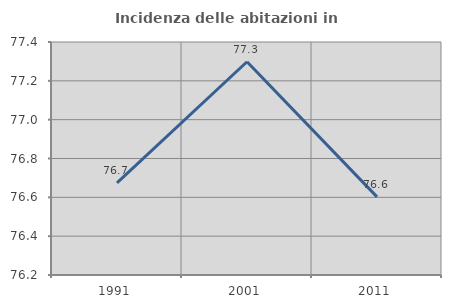
| Category | Incidenza delle abitazioni in proprietà  |
|---|---|
| 1991.0 | 76.675 |
| 2001.0 | 77.298 |
| 2011.0 | 76.603 |